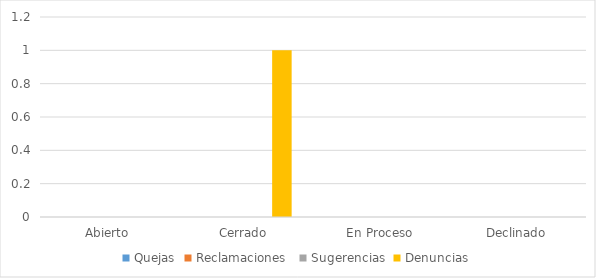
| Category | Quejas | Reclamaciones  | Sugerencias | Denuncias |
|---|---|---|---|---|
| Abierto | 0 | 0 | 0 | 0 |
| Cerrado | 0 | 0 | 0 | 1 |
| En Proceso | 0 | 0 | 0 | 0 |
| Declinado | 0 | 0 | 0 | 0 |